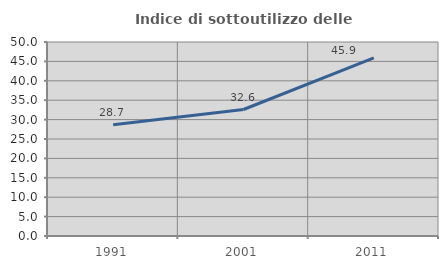
| Category | Indice di sottoutilizzo delle abitazioni  |
|---|---|
| 1991.0 | 28.702 |
| 2001.0 | 32.599 |
| 2011.0 | 45.896 |